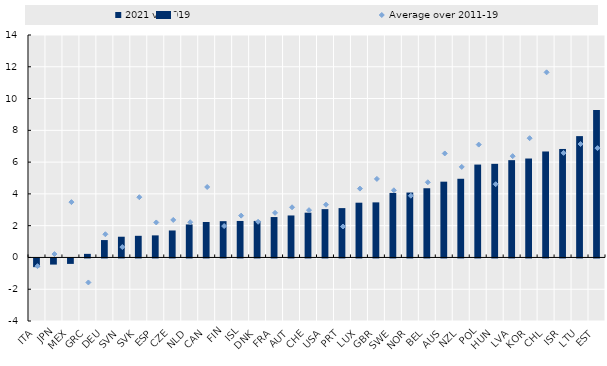
| Category | 2021 vs 2019 |
|---|---|
| ITA | -0.549 |
| JPN | -0.387 |
| MEX | -0.344 |
| GRC | 0.226 |
| DEU | 1.094 |
| SVN | 1.304 |
| SVK | 1.362 |
| ESP | 1.389 |
| CZE | 1.697 |
| NLD | 2.078 |
| CAN | 2.232 |
| FIN | 2.283 |
| ISL | 2.296 |
| DNK | 2.3 |
| FRA | 2.543 |
| AUT | 2.642 |
| CHE | 2.817 |
| USA | 3.041 |
| PRT | 3.105 |
| LUX | 3.446 |
| GBR | 3.466 |
| SWE | 4.059 |
| NOR | 4.085 |
| BEL | 4.355 |
| AUS | 4.769 |
| NZL | 4.951 |
| POL | 5.845 |
| HUN | 5.891 |
| LVA | 6.123 |
| KOR | 6.226 |
| CHL | 6.669 |
| ISR | 6.827 |
| LTU | 7.636 |
| EST | 9.287 |